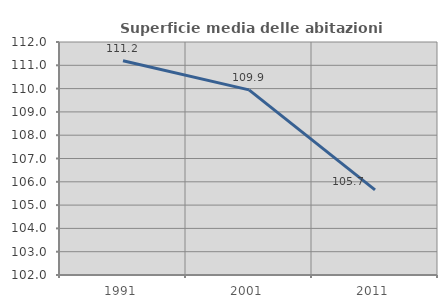
| Category | Superficie media delle abitazioni occupate |
|---|---|
| 1991.0 | 111.196 |
| 2001.0 | 109.944 |
| 2011.0 | 105.654 |